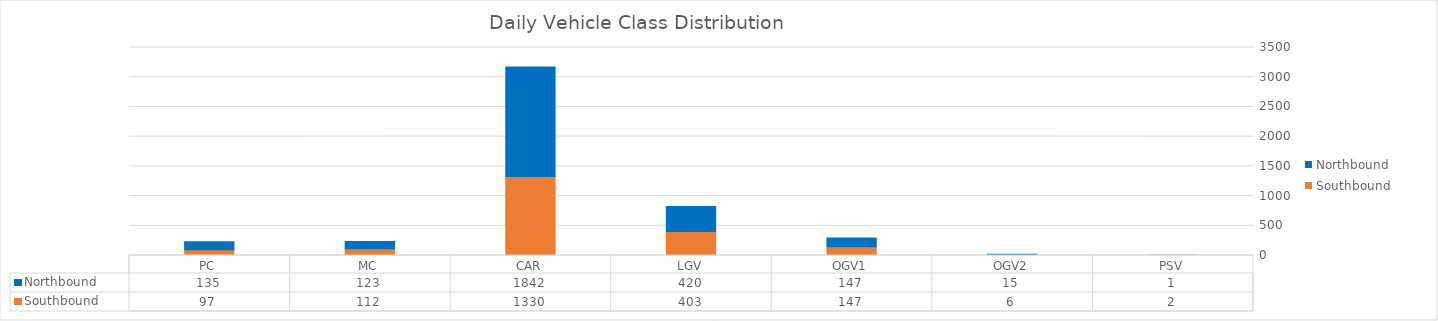
| Category | Southbound | Northbound |
|---|---|---|
| PC | 97 | 135 |
| MC | 112 | 123 |
| CAR | 1330 | 1842 |
| LGV | 403 | 420 |
| OGV1 | 147 | 147 |
| OGV2 | 6 | 15 |
| PSV | 2 | 1 |